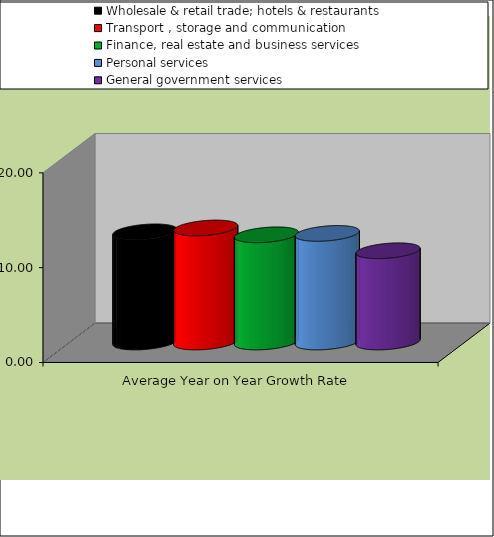
| Category | Wholesale & retail trade; hotels & restaurants | Transport , storage and communication | Finance, real estate and business services | Personal services | General government services |
|---|---|---|---|---|---|
| Average Year on Year Growth Rate | 11.617 | 12.027 | 11.304 | 11.453 | 9.623 |